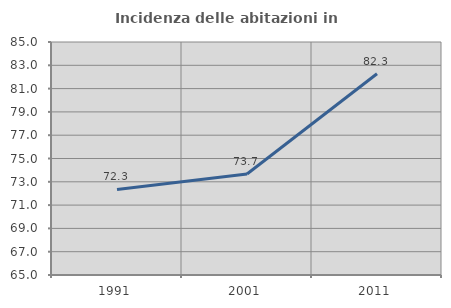
| Category | Incidenza delle abitazioni in proprietà  |
|---|---|
| 1991.0 | 72.34 |
| 2001.0 | 73.665 |
| 2011.0 | 82.27 |